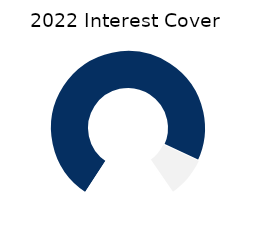
| Category | Series 1 |
|---|---|
| 0 | 116.46 |
| 1 | 13.54 |
| 2 | 30 |